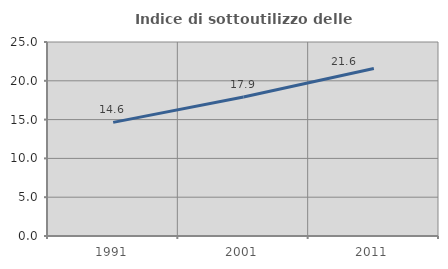
| Category | Indice di sottoutilizzo delle abitazioni  |
|---|---|
| 1991.0 | 14.639 |
| 2001.0 | 17.902 |
| 2011.0 | 21.58 |